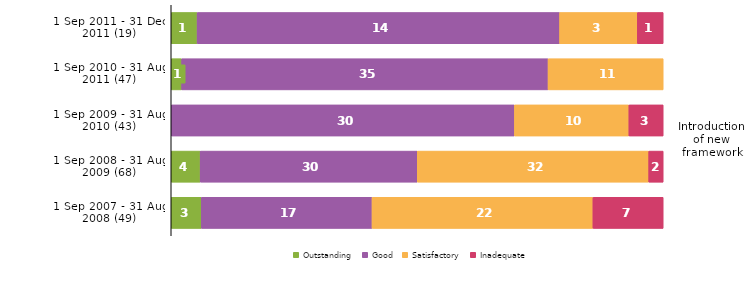
| Category | Outstanding | Good | Satisfactory | Inadequate |
|---|---|---|---|---|
| 1 Sep 2011 - 31 Dec 2011 (19) | 1 | 14 | 3 | 1 |
| 1 Sep 2010 - 31 Aug 2011 (47) | 1 | 35 | 11 | 0 |
| 1 Sep 2009 - 31 Aug 2010 (43) | 0 | 30 | 10 | 3 |
| 1 Sep 2008 - 31 Aug 2009 (68) | 4 | 30 | 32 | 2 |
| 1 Sep 2007 - 31 Aug 2008 (49) | 3 | 17 | 22 | 7 |